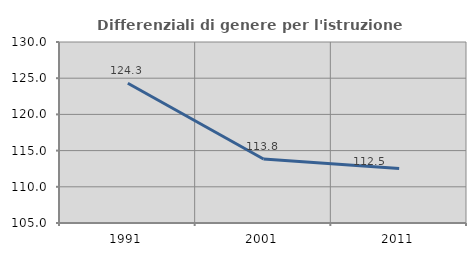
| Category | Differenziali di genere per l'istruzione superiore |
|---|---|
| 1991.0 | 124.298 |
| 2001.0 | 113.844 |
| 2011.0 | 112.512 |